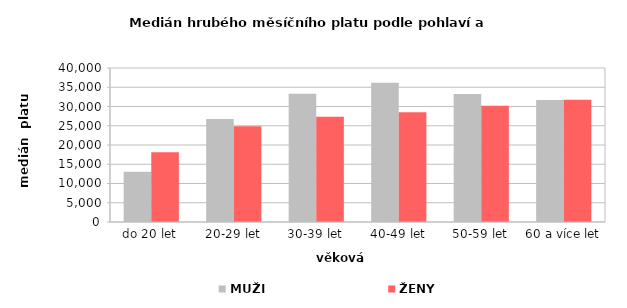
| Category | MUŽI | ŽENY |
|---|---|---|
| 0 | 13067.222 | 18144.406 |
| 1 | 26732.849 | 24898.079 |
| 2 | 33306.198 | 27365.309 |
| 3 | 36188.574 | 28521.593 |
| 4 | 33261.821 | 30201.277 |
| 5 | 31693.855 | 31751.02 |